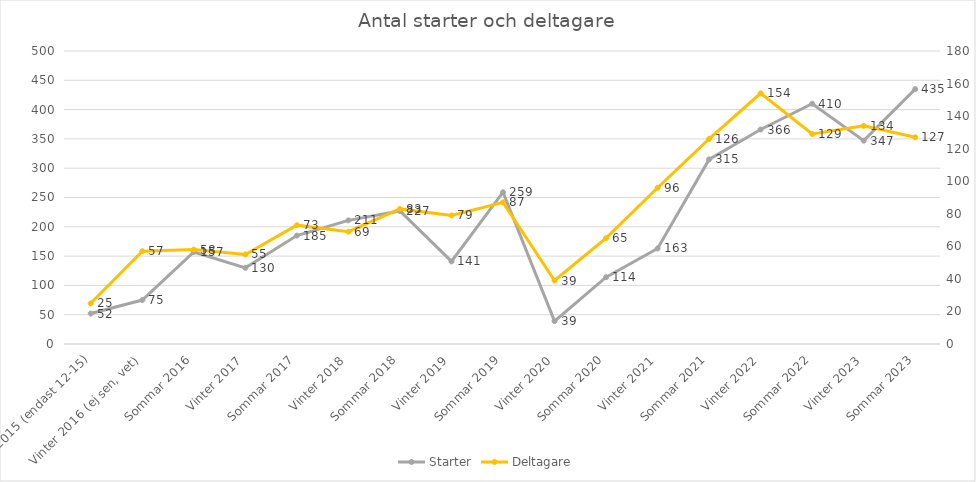
| Category | Starter |
|---|---|
| Vinter 2015 (endast 12-15) | 52 |
| Vinter 2016 (ej sen, vet) | 75 |
| Sommar 2016 | 157 |
| Vinter 2017 | 130 |
| Sommar 2017 | 185 |
| Vinter 2018 | 211 |
| Sommar 2018 | 227 |
| Vinter 2019 | 141 |
| Sommar 2019 | 259 |
| Vinter 2020 | 39 |
| Sommar 2020 | 114 |
| Vinter 2021 | 163 |
| Sommar 2021 | 315 |
| Vinter 2022 | 366 |
| Sommar 2022 | 410 |
| Vinter 2023 | 347 |
| Sommar 2023 | 435 |